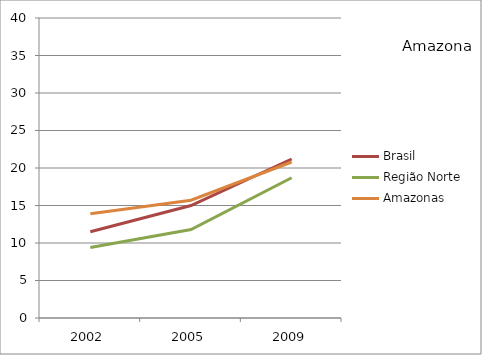
| Category | Brasil | Região Norte | Amazonas |
|---|---|---|---|
| 2002.0 | 11.5 | 9.4 | 13.9 |
| 2005.0 | 15 | 11.8 | 15.7 |
| 2009.0 | 21.2 | 18.7 | 20.8 |